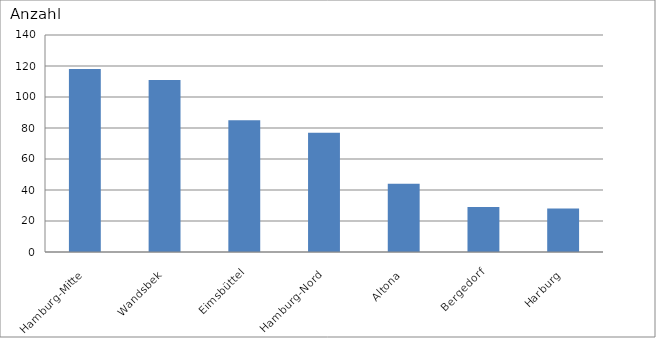
| Category | Hamburg-Mitte |
|---|---|
| Hamburg-Mitte | 118 |
| Wandsbek | 111 |
| Eimsbüttel | 85 |
| Hamburg-Nord | 77 |
| Altona | 44 |
| Bergedorf | 29 |
| Harburg | 28 |